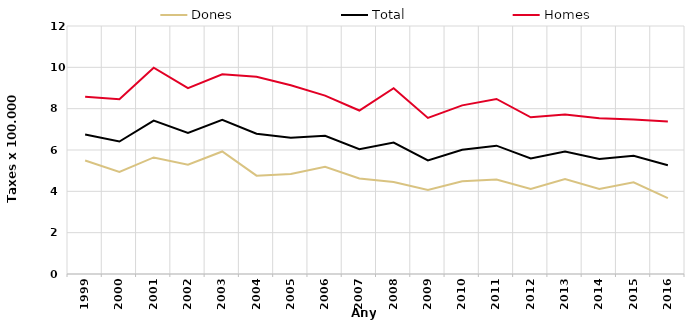
| Category | Dones | Total | Homes |
|---|---|---|---|
| 1999.0 | 5.49 | 6.75 | 8.58 |
| 2000.0 | 4.94 | 6.41 | 8.46 |
| 2001.0 | 5.64 | 7.42 | 9.98 |
| 2002.0 | 5.29 | 6.82 | 8.99 |
| 2003.0 | 5.93 | 7.46 | 9.66 |
| 2004.0 | 4.76 | 6.79 | 9.54 |
| 2005.0 | 4.84 | 6.59 | 9.13 |
| 2006.0 | 5.19 | 6.69 | 8.63 |
| 2007.0 | 4.62 | 6.04 | 7.91 |
| 2008.0 | 4.45 | 6.36 | 8.99 |
| 2009.0 | 4.07 | 5.5 | 7.55 |
| 2010.0 | 4.49 | 6.01 | 8.16 |
| 2011.0 | 4.57 | 6.21 | 8.47 |
| 2012.0 | 4.12 | 5.59 | 7.58 |
| 2013.0 | 4.6 | 5.93 | 7.72 |
| 2014.0 | 4.11 | 5.57 | 7.54 |
| 2015.0 | 4.44 | 5.72 | 7.48 |
| 2016.0 | 3.67 | 5.26 | 7.38 |